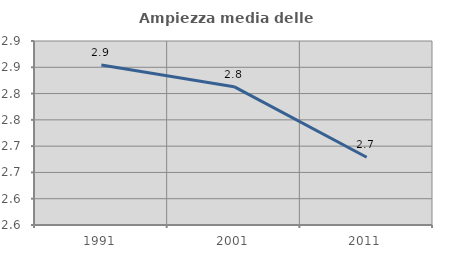
| Category | Ampiezza media delle famiglie |
|---|---|
| 1991.0 | 2.854 |
| 2001.0 | 2.813 |
| 2011.0 | 2.679 |